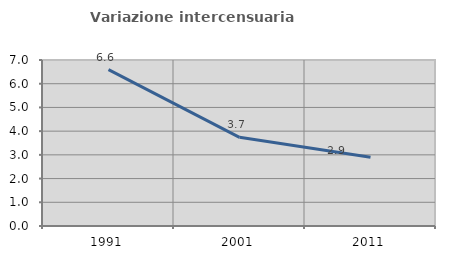
| Category | Variazione intercensuaria annua |
|---|---|
| 1991.0 | 6.596 |
| 2001.0 | 3.738 |
| 2011.0 | 2.898 |